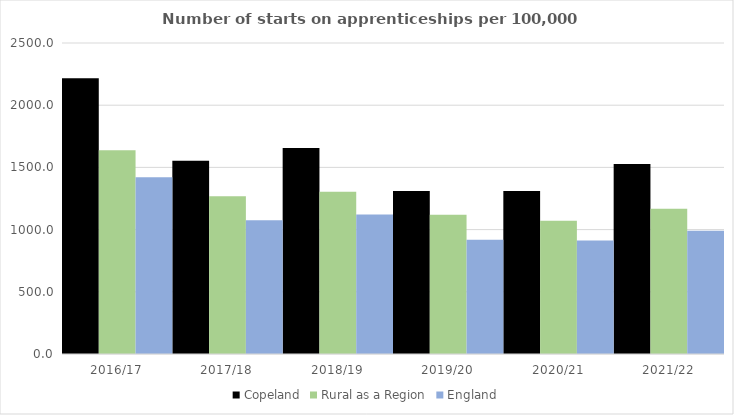
| Category | Copeland | Rural as a Region | England |
|---|---|---|---|
| 2016/17 | 2216 | 1638.789 | 1420 |
| 2017/18 | 1554 | 1267.474 | 1075 |
| 2018/19 | 1655 | 1304.57 | 1122 |
| 2019/20 | 1311 | 1119.662 | 918 |
| 2020/21 | 1310 | 1070.748 | 912 |
| 2021/22 | 1527 | 1167.68 | 991 |